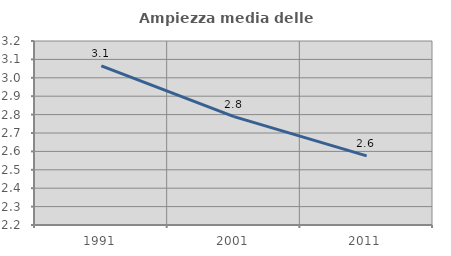
| Category | Ampiezza media delle famiglie |
|---|---|
| 1991.0 | 3.064 |
| 2001.0 | 2.789 |
| 2011.0 | 2.576 |